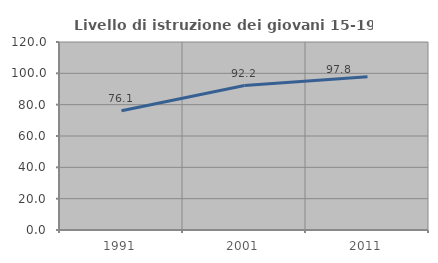
| Category | Livello di istruzione dei giovani 15-19 anni |
|---|---|
| 1991.0 | 76.071 |
| 2001.0 | 92.224 |
| 2011.0 | 97.758 |